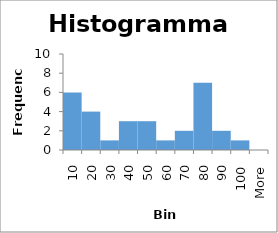
| Category | Frequency |
|---|---|
| 10 | 6 |
| 20 | 4 |
| 30 | 1 |
| 40 | 3 |
| 50 | 3 |
| 60 | 1 |
| 70 | 2 |
| 80 | 7 |
| 90 | 2 |
| 100 | 1 |
| More | 0 |